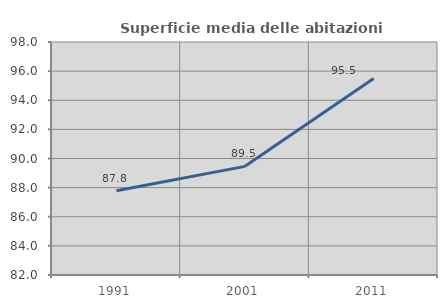
| Category | Superficie media delle abitazioni occupate |
|---|---|
| 1991.0 | 87.79 |
| 2001.0 | 89.46 |
| 2011.0 | 95.495 |